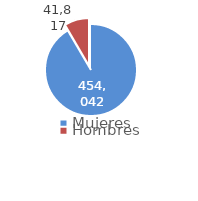
| Category | Series 0 |
|---|---|
| Mujeres | 454042 |
| Hombres | 41817 |